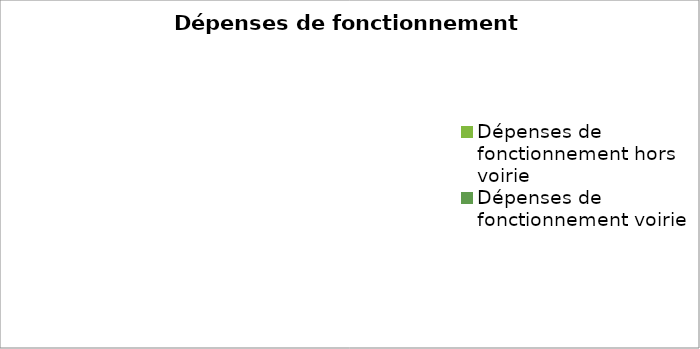
| Category | Series 0 |
|---|---|
| Dépenses de fonctionnement hors voirie | 0 |
| Dépenses de fonctionnement voirie | 0 |